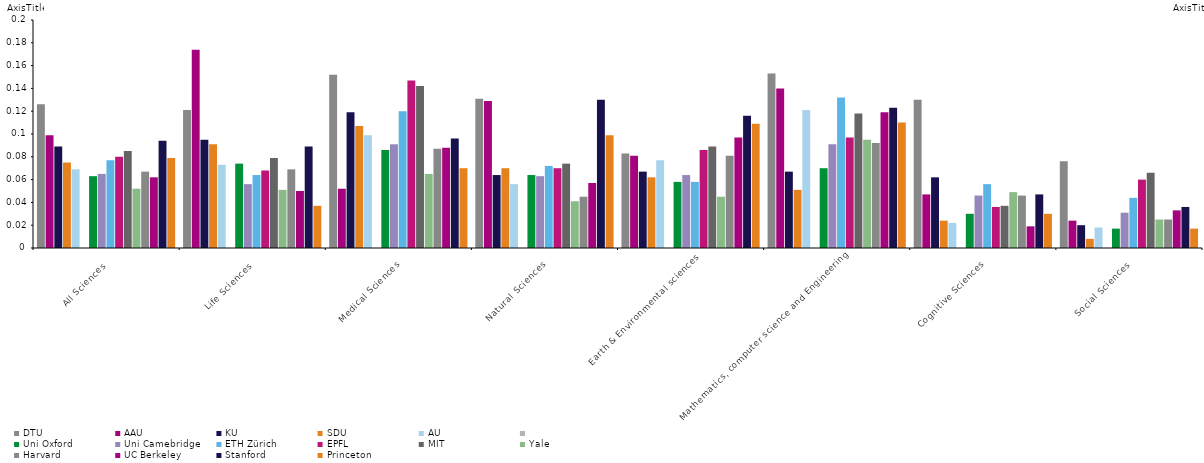
| Category | DTU | AAU | KU | SDU | AU | Series 5 | Uni Oxford | Uni Camebridge | ETH Zürich | EPFL | MIT | Yale | Harvard | UC Berkeley | Stanford | Princeton |
|---|---|---|---|---|---|---|---|---|---|---|---|---|---|---|---|---|
| All Sciences | 0.126 | 0.099 | 0.089 | 0.075 | 0.069 |  | 0.063 | 0.065 | 0.077 | 0.08 | 0.085 | 0.052 | 0.067 | 0.062 | 0.094 | 0.079 |
| Life Sciences | 0.121 | 0.174 | 0.095 | 0.091 | 0.073 |  | 0.074 | 0.056 | 0.064 | 0.068 | 0.079 | 0.051 | 0.069 | 0.05 | 0.089 | 0.037 |
| Medical Sciences | 0.152 | 0.052 | 0.119 | 0.107 | 0.099 |  | 0.086 | 0.091 | 0.12 | 0.147 | 0.142 | 0.065 | 0.087 | 0.088 | 0.096 | 0.07 |
| Natural Sciences | 0.131 | 0.129 | 0.064 | 0.07 | 0.056 |  | 0.064 | 0.063 | 0.072 | 0.07 | 0.074 | 0.041 | 0.045 | 0.057 | 0.13 | 0.099 |
| Earth & Environmental sciences | 0.083 | 0.081 | 0.067 | 0.062 | 0.077 |  | 0.058 | 0.064 | 0.058 | 0.086 | 0.089 | 0.045 | 0.081 | 0.097 | 0.116 | 0.109 |
| Mathematics, computer science and Engineering | 0.153 | 0.14 | 0.067 | 0.051 | 0.121 |  | 0.07 | 0.091 | 0.132 | 0.097 | 0.118 | 0.095 | 0.092 | 0.119 | 0.123 | 0.11 |
| Cognitive Sciences | 0.13 | 0.047 | 0.062 | 0.024 | 0.022 |  | 0.03 | 0.046 | 0.056 | 0.036 | 0.037 | 0.049 | 0.046 | 0.019 | 0.047 | 0.03 |
| Social Sciences | 0.076 | 0.024 | 0.02 | 0.008 | 0.018 |  | 0.017 | 0.031 | 0.044 | 0.06 | 0.066 | 0.025 | 0.025 | 0.033 | 0.036 | 0.017 |